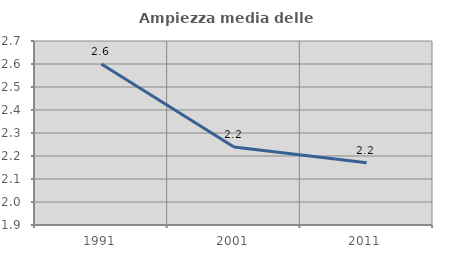
| Category | Ampiezza media delle famiglie |
|---|---|
| 1991.0 | 2.6 |
| 2001.0 | 2.239 |
| 2011.0 | 2.171 |